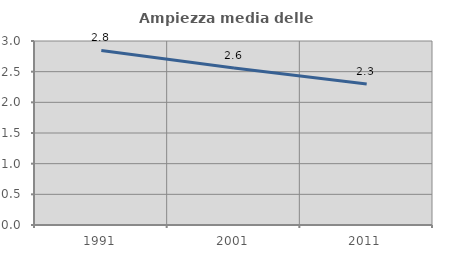
| Category | Ampiezza media delle famiglie |
|---|---|
| 1991.0 | 2.846 |
| 2001.0 | 2.56 |
| 2011.0 | 2.298 |